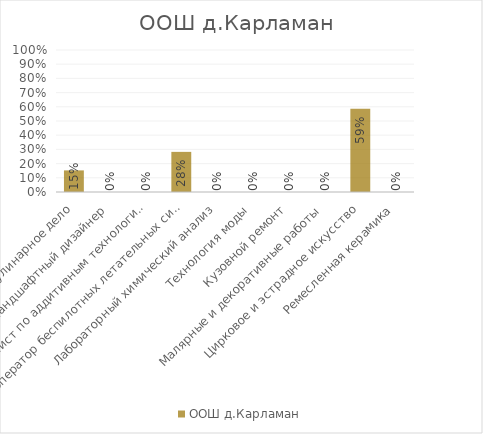
| Category | ООШ д.Карламан |
|---|---|
| Кулинарное дело | 0.152 |
| Ландшафтный дизайнер | 0 |
| Специалист по аддитивным технологиям | 0 |
| Оператор беспилотных летательных систем | 0.283 |
| Лабораторный химический анализ | 0 |
| Технология моды | 0 |
| Кузовной ремонт | 0 |
| Малярные и декоративные работы | 0 |
| Цирковое и эстрадное искусство | 0.587 |
| Ремесленная керамика | 0 |